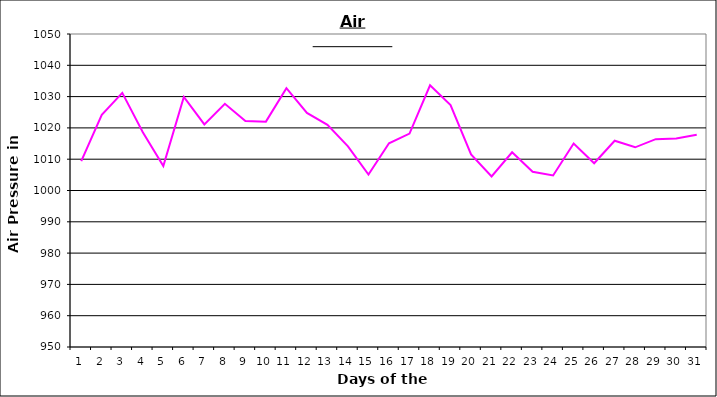
| Category | Series 0 |
|---|---|
| 0 | 1009.4 |
| 1 | 1024.2 |
| 2 | 1031.2 |
| 3 | 1018.6 |
| 4 | 1007.8 |
| 5 | 1029.9 |
| 6 | 1021.1 |
| 7 | 1027.7 |
| 8 | 1022.2 |
| 9 | 1022 |
| 10 | 1032.7 |
| 11 | 1024.8 |
| 12 | 1021 |
| 13 | 1014.1 |
| 14 | 1005.1 |
| 15 | 1015.1 |
| 16 | 1018.2 |
| 17 | 1033.6 |
| 18 | 1027.3 |
| 19 | 1011.5 |
| 20 | 1004.5 |
| 21 | 1012.2 |
| 22 | 1006 |
| 23 | 1004.8 |
| 24 | 1015 |
| 25 | 1008.7 |
| 26 | 1015.9 |
| 27 | 1013.8 |
| 28 | 1016.4 |
| 29 | 1016.6 |
| 30 | 1017.8 |